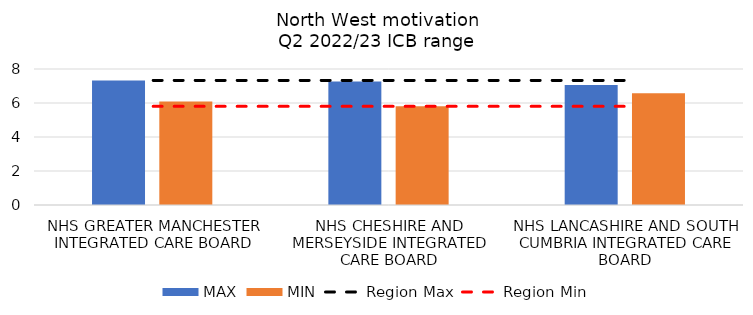
| Category | MAX | MIN |
|---|---|---|
| NHS GREATER MANCHESTER INTEGRATED CARE BOARD | 7.327 | 6.093 |
| NHS CHESHIRE AND MERSEYSIDE INTEGRATED CARE BOARD | 7.269 | 5.804 |
| NHS LANCASHIRE AND SOUTH CUMBRIA INTEGRATED CARE BOARD | 7.065 | 6.574 |